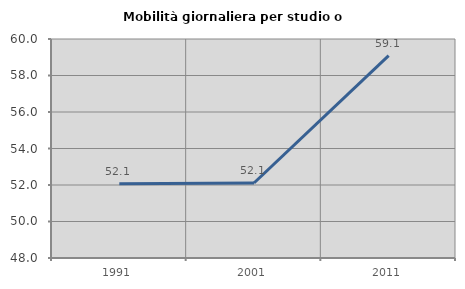
| Category | Mobilità giornaliera per studio o lavoro |
|---|---|
| 1991.0 | 52.067 |
| 2001.0 | 52.108 |
| 2011.0 | 59.085 |